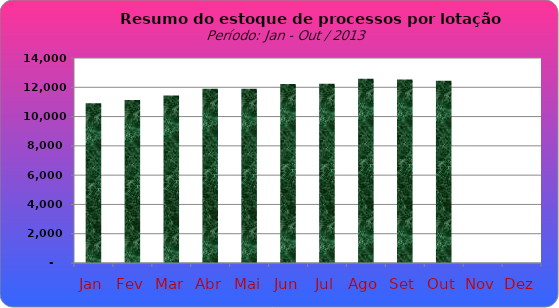
| Category | Series 0 |
|---|---|
| Jan | 10909 |
| Fev | 11131 |
| Mar | 11446 |
| Abr | 11893 |
| Mai | 11901 |
| Jun | 12228 |
| Jul | 12248 |
| Ago | 12576 |
| Set | 12532 |
| Out | 12450 |
| Nov | 0 |
| Dez | 0 |